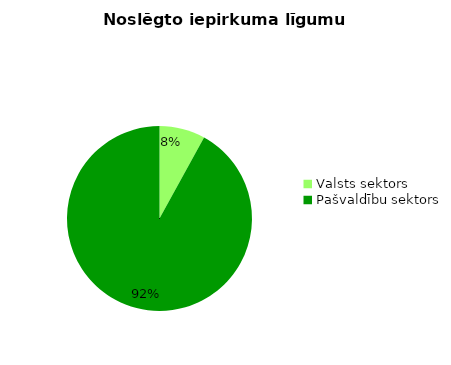
| Category | Noslēgto iepirkuma līgumu skaits |
|---|---|
| Valsts sektors | 4 |
| Pašvaldību sektors | 46 |